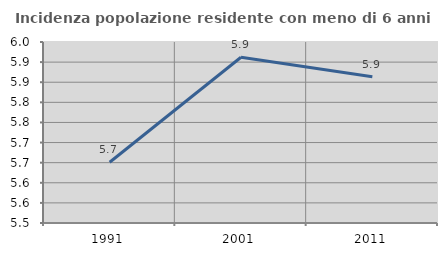
| Category | Incidenza popolazione residente con meno di 6 anni |
|---|---|
| 1991.0 | 5.651 |
| 2001.0 | 5.912 |
| 2011.0 | 5.863 |